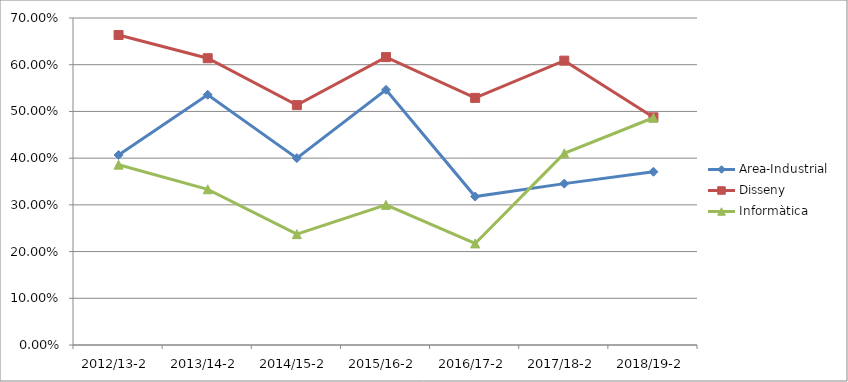
| Category | Area-Industrial | Disseny | Informàtica | Series 3 |
|---|---|---|---|---|
| 2012/13-2 | 0.407 | 0.664 | 0.386 |  |
| 2013/14-2 | 0.536 | 0.614 | 0.333 |  |
| 2014/15-2 | 0.4 | 0.514 | 0.237 |  |
| 2015/16-2 | 0.546 | 0.616 | 0.3 |  |
| 2016/17-2 | 0.318 | 0.529 | 0.217 |  |
| 2017/18-2 | 0.345 | 0.609 | 0.41 |  |
| 2018/19-2 | 0.371 | 0.487 | 0.486 |  |